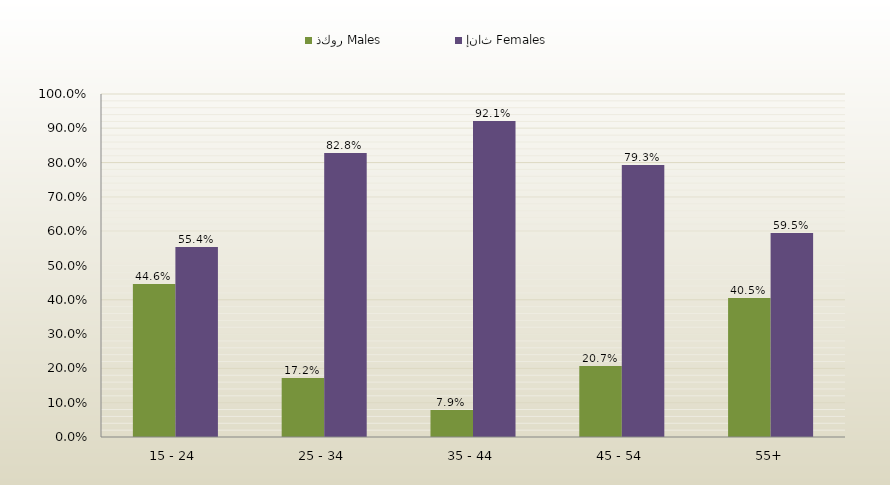
| Category | ذكور Males | إناث Females |
|---|---|---|
| 15 - 24 | 0.446 | 0.554 |
| 25 - 34 | 0.172 | 0.828 |
| 35 - 44 | 0.079 | 0.921 |
| 45 - 54 | 0.207 | 0.793 |
| 55+ | 0.405 | 0.595 |